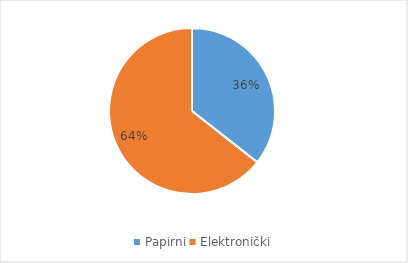
| Category | Series 0 |
|---|---|
| Papirni | 62028081 |
| Elektronički | 112243502 |